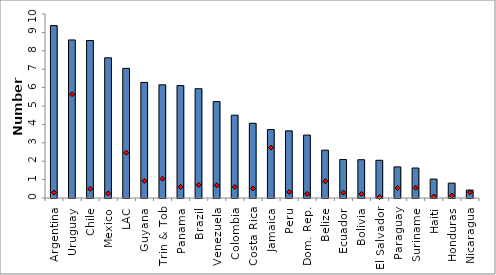
| Category | 2008 |
|---|---|
| Argentina | 9.37 |
| Uruguay | 8.59 |
| Chile | 8.56 |
| Mexico | 7.62 |
| LAC | 7.045 |
| Guyana | 6.28 |
| Trin & Tob | 6.15 |
| Panama | 6.11 |
| Brazil | 5.94 |
| Venezuela | 5.24 |
| Colombia | 4.5 |
| Costa Rica | 4.06 |
| Jamaica | 3.72 |
| Peru | 3.65 |
| Dom. Rep. | 3.42 |
| Belize | 2.6 |
| Ecuador | 2.09 |
| Bolivia | 2.08 |
| El Salvador | 2.05 |
| Paraguay | 1.69 |
| Suriname | 1.63 |
| Haiti | 1.03 |
| Honduras | 0.81 |
| Nicaragua | 0.43 |